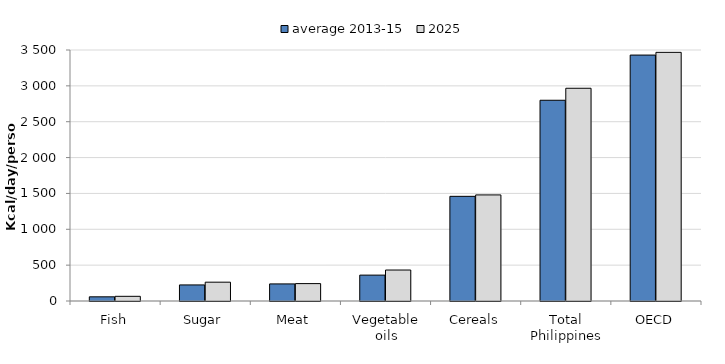
| Category | average 2013-15 | 2025 |
|---|---|---|
| Fish | 58.201 | 65.147 |
| Sugar | 223.98 | 262.403 |
| Meat | 238.263 | 242.57 |
| Vegetable oils | 360.999 | 431.903 |
| Cereals | 1459.392 | 1479.378 |
| Total Philippines | 2799.261 | 2966.503 |
| OECD | 3429.239 | 3467.154 |